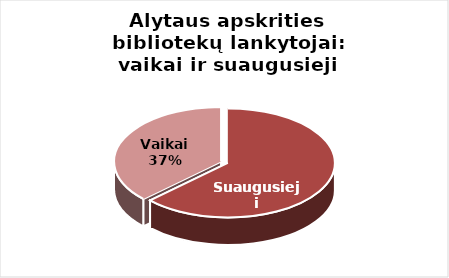
| Category | Series 0 |
|---|---|
| Suaugusieji | 459044 |
| Vaikai | 270333 |